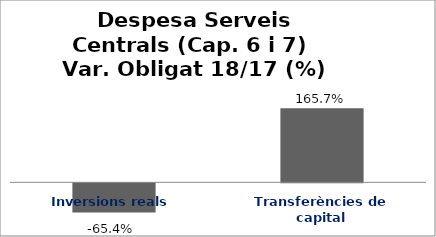
| Category | Series 0 |
|---|---|
| Inversions reals | -0.654 |
| Transferències de capital | 1.657 |